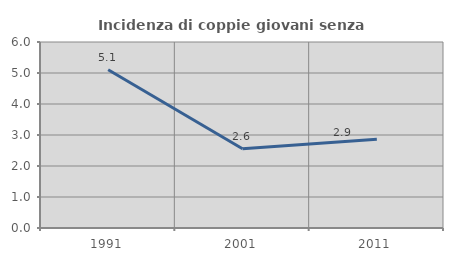
| Category | Incidenza di coppie giovani senza figli |
|---|---|
| 1991.0 | 5.103 |
| 2001.0 | 2.558 |
| 2011.0 | 2.865 |